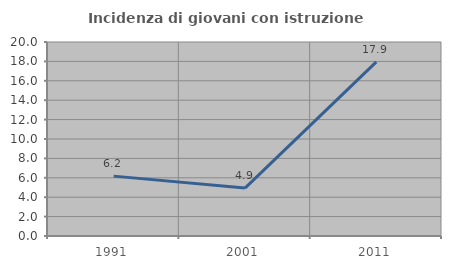
| Category | Incidenza di giovani con istruzione universitaria |
|---|---|
| 1991.0 | 6.173 |
| 2001.0 | 4.938 |
| 2011.0 | 17.949 |